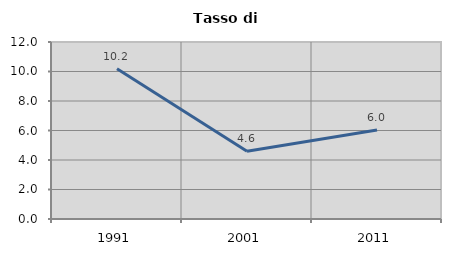
| Category | Tasso di disoccupazione   |
|---|---|
| 1991.0 | 10.18 |
| 2001.0 | 4.592 |
| 2011.0 | 6.037 |